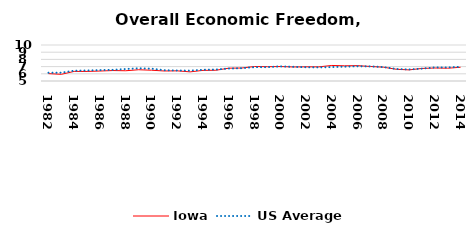
| Category | Iowa | US Average |
|---|---|---|
| 1982.0 | 6.023 | 6.149 |
| 1983.0 | 5.928 | 6.152 |
| 1984.0 | 6.331 | 6.429 |
| 1985.0 | 6.33 | 6.464 |
| 1986.0 | 6.383 | 6.512 |
| 1987.0 | 6.454 | 6.552 |
| 1988.0 | 6.423 | 6.659 |
| 1989.0 | 6.563 | 6.767 |
| 1990.0 | 6.495 | 6.71 |
| 1991.0 | 6.391 | 6.502 |
| 1992.0 | 6.41 | 6.463 |
| 1993.0 | 6.267 | 6.446 |
| 1994.0 | 6.475 | 6.563 |
| 1995.0 | 6.493 | 6.593 |
| 1996.0 | 6.779 | 6.73 |
| 1997.0 | 6.802 | 6.781 |
| 1998.0 | 7.013 | 6.926 |
| 1999.0 | 6.988 | 6.925 |
| 2000.0 | 7.007 | 7.031 |
| 2001.0 | 6.949 | 6.969 |
| 2002.0 | 6.969 | 6.912 |
| 2003.0 | 6.965 | 6.892 |
| 2004.0 | 7.158 | 6.934 |
| 2005.0 | 7.113 | 6.99 |
| 2006.0 | 7.134 | 7.048 |
| 2007.0 | 7.016 | 7.028 |
| 2008.0 | 6.92 | 6.935 |
| 2009.0 | 6.633 | 6.668 |
| 2010.0 | 6.545 | 6.605 |
| 2011.0 | 6.741 | 6.72 |
| 2012.0 | 6.807 | 6.883 |
| 2013.0 | 6.775 | 6.881 |
| 2014.0 | 6.907 | 6.973 |